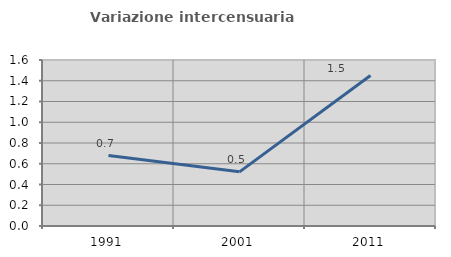
| Category | Variazione intercensuaria annua |
|---|---|
| 1991.0 | 0.679 |
| 2001.0 | 0.522 |
| 2011.0 | 1.451 |